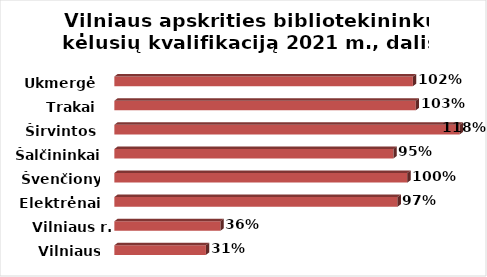
| Category | Series 0 |
|---|---|
| Vilniaus m. | 0.312 |
| Vilniaus r. | 0.362 |
| Elektrėnai | 0.967 |
| Švenčionys | 1 |
| Šalčininkai | 0.952 |
| Širvintos | 1.179 |
| Trakai | 1.029 |
| Ukmergė | 1.019 |